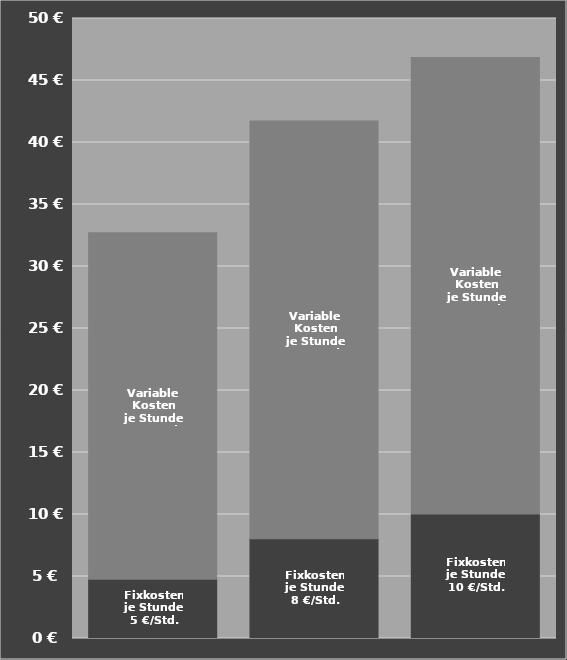
| Category | Fixkosten
je Stunde | Variable Kosten
je Stunde |
|---|---|---|
| Trecker 70 PS | 4.771 | 27.951 |
| Trecker 120 PS | 8.035 | 33.702 |
| Trecker 160 PS | 10.044 | 36.802 |